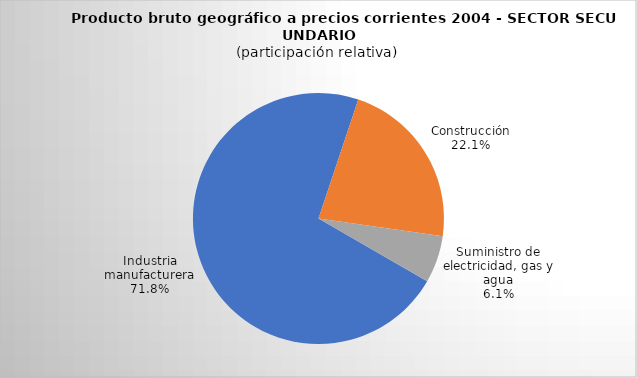
| Category | Series 0 |
|---|---|
| Industria manufacturera | 1138.721 |
| Construcción | 350.737 |
| Suministro de electricidad, gas y agua | 96.359 |